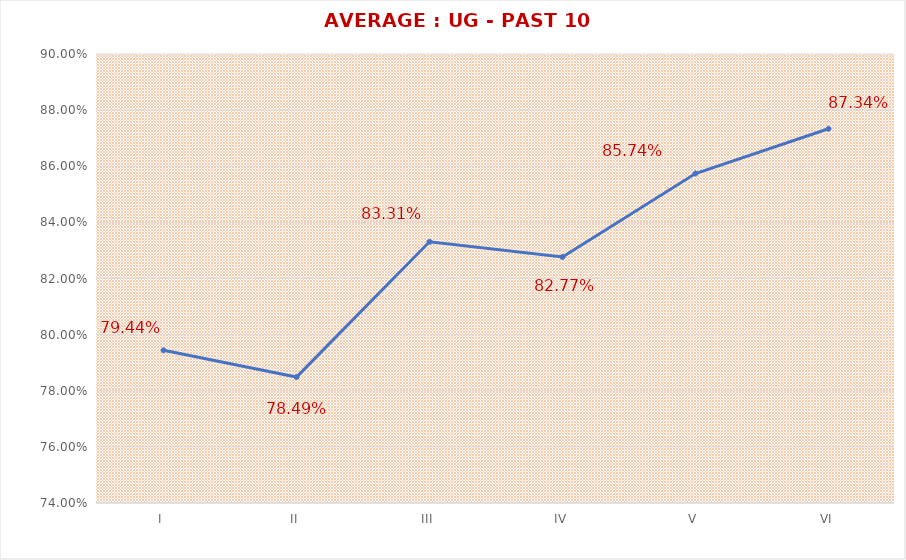
| Category | AVERAGE : UG - PAST 10 YEARS |
|---|---|
| I | 0.794 |
| II | 0.785 |
| III | 0.833 |
| IV | 0.828 |
| V | 0.857 |
| VI | 0.873 |